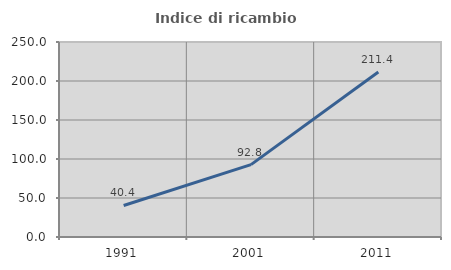
| Category | Indice di ricambio occupazionale  |
|---|---|
| 1991.0 | 40.404 |
| 2001.0 | 92.754 |
| 2011.0 | 211.429 |